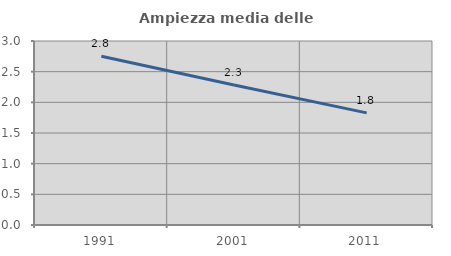
| Category | Ampiezza media delle famiglie |
|---|---|
| 1991.0 | 2.751 |
| 2001.0 | 2.283 |
| 2011.0 | 1.828 |